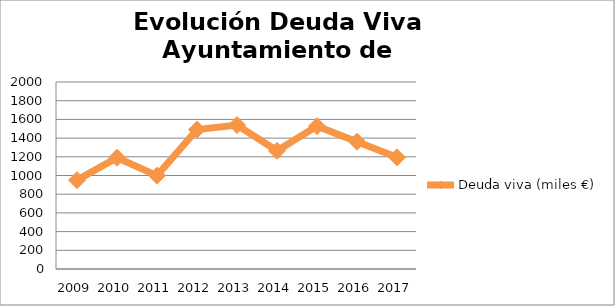
| Category | Deuda viva (miles €) |
|---|---|
| 2009.0 | 950 |
| 2010.0 | 1190 |
| 2011.0 | 999 |
| 2012.0 | 1491 |
| 2013.0 | 1540 |
| 2014.0 | 1264 |
| 2015.0 | 1528 |
| 2016.0 | 1362 |
| 2017.0 | 1195 |